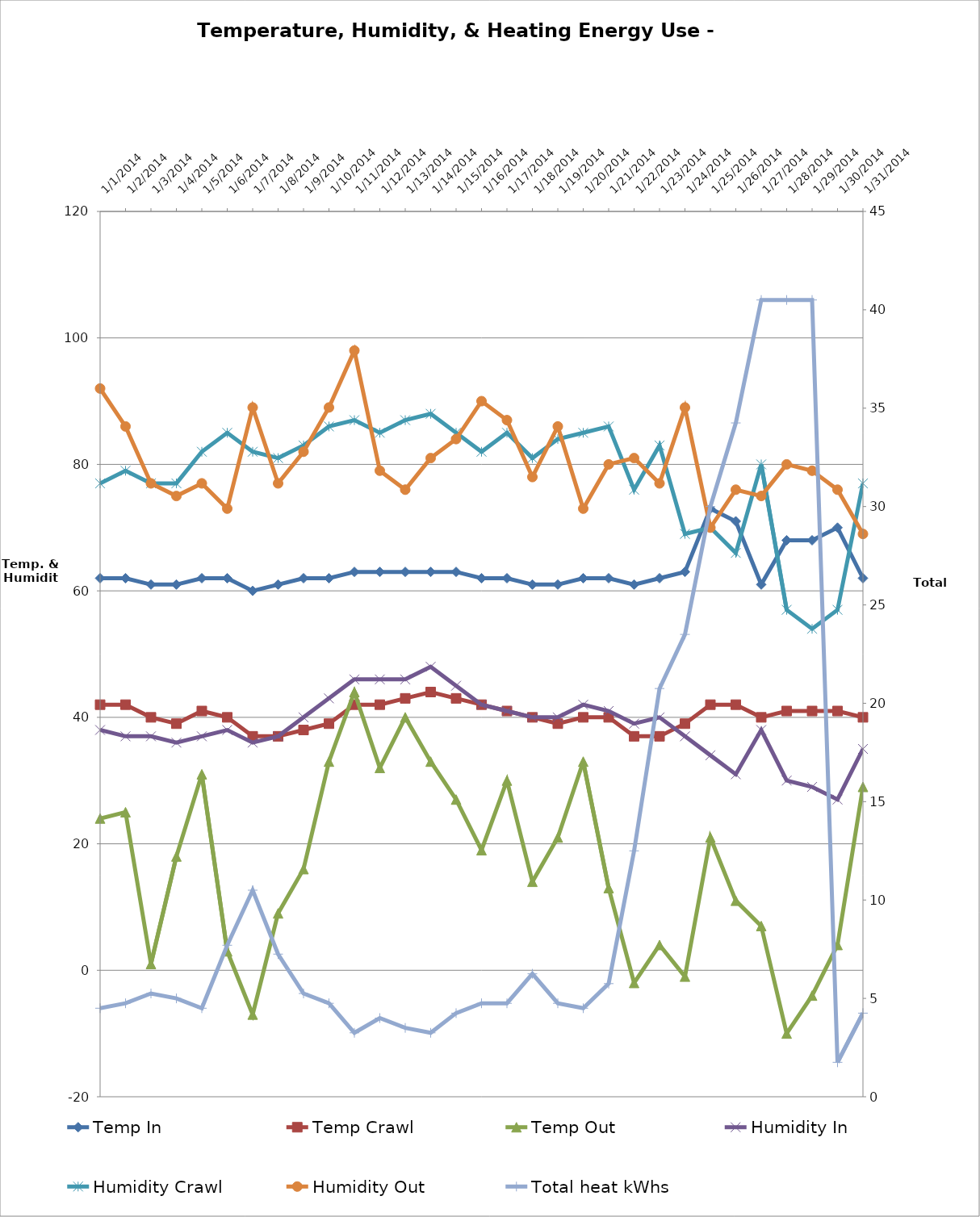
| Category | Temp In | Temp Crawl | Temp Out | Humidity In | Humidity Crawl | Humidity Out |
|---|---|---|---|---|---|---|
| 1/1/14 | 62 | 42 | 24 | 38 | 77 | 92 |
| 1/2/14 | 62 | 42 | 25 | 37 | 79 | 86 |
| 1/3/14 | 61 | 40 | 1 | 37 | 77 | 77 |
| 1/4/14 | 61 | 39 | 18 | 36 | 77 | 75 |
| 1/5/14 | 62 | 41 | 31 | 37 | 82 | 77 |
| 1/6/14 | 62 | 40 | 3 | 38 | 85 | 73 |
| 1/7/14 | 60 | 37 | -7 | 36 | 82 | 89 |
| 1/8/14 | 61 | 37 | 9 | 37 | 81 | 77 |
| 1/9/14 | 62 | 38 | 16 | 40 | 83 | 82 |
| 1/10/14 | 62 | 39 | 33 | 43 | 86 | 89 |
| 1/11/14 | 63 | 42 | 44 | 46 | 87 | 98 |
| 1/12/14 | 63 | 42 | 32 | 46 | 85 | 79 |
| 1/13/14 | 63 | 43 | 40 | 46 | 87 | 76 |
| 1/14/14 | 63 | 44 | 33 | 48 | 88 | 81 |
| 1/15/14 | 63 | 43 | 27 | 45 | 85 | 84 |
| 1/16/14 | 62 | 42 | 19 | 42 | 82 | 90 |
| 1/17/14 | 62 | 41 | 30 | 41 | 85 | 87 |
| 1/18/14 | 61 | 40 | 14 | 40 | 81 | 78 |
| 1/19/14 | 61 | 39 | 21 | 40 | 84 | 86 |
| 1/20/14 | 62 | 40 | 33 | 42 | 85 | 73 |
| 1/21/14 | 62 | 40 | 13 | 41 | 86 | 80 |
| 1/22/14 | 61 | 37 | -2 | 39 | 76 | 81 |
| 1/23/14 | 62 | 37 | 4 | 40 | 83 | 77 |
| 1/24/14 | 63 | 39 | -1 | 37 | 69 | 89 |
| 1/25/14 | 73 | 42 | 21 | 34 | 70 | 70 |
| 1/26/14 | 71 | 42 | 11 | 31 | 66 | 76 |
| 1/27/14 | 61 | 40 | 7 | 38 | 80 | 75 |
| 1/28/14 | 68 | 41 | -10 | 30 | 57 | 80 |
| 1/29/14 | 68 | 41 | -4 | 29 | 54 | 79 |
| 1/30/14 | 70 | 41 | 4 | 27 | 57 | 76 |
| 1/31/14 | 62 | 40 | 29 | 35 | 77 | 69 |